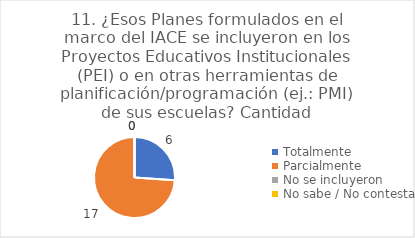
| Category | 11. ¿Esos Planes formulados en el marco del IACE se incluyeron en los Proyectos Educativos Institucionales (PEI) o en otras herramientas de planificación/programación (ej.: PMI) de sus escuelas? |
|---|---|
| Totalmente  | 0.261 |
| Parcialmente  | 0.739 |
| No se incluyeron  | 0 |
| No sabe / No contesta | 0 |